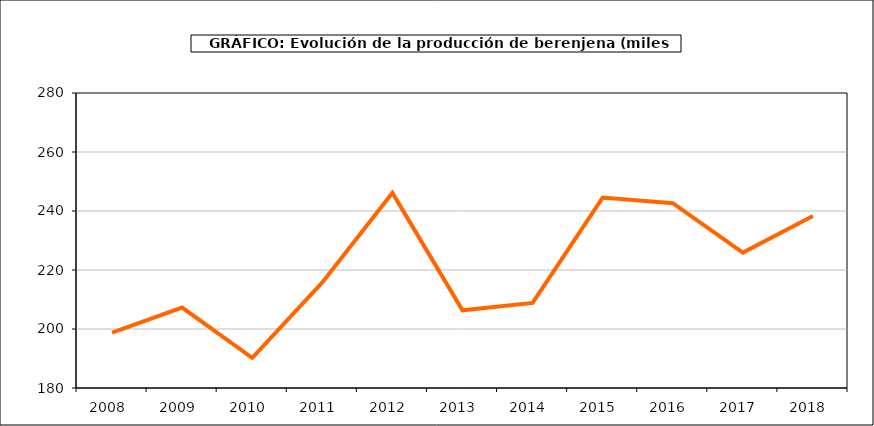
| Category | producción |
|---|---|
| 2008.0 | 198.768 |
| 2009.0 | 207.269 |
| 2010.0 | 190.195 |
| 2011.0 | 215.769 |
| 2012.0 | 246.142 |
| 2013.0 | 206.333 |
| 2014.0 | 208.821 |
| 2015.0 | 244.54 |
| 2016.0 | 242.643 |
| 2017.0 | 225.912 |
| 2018.0 | 238.325 |